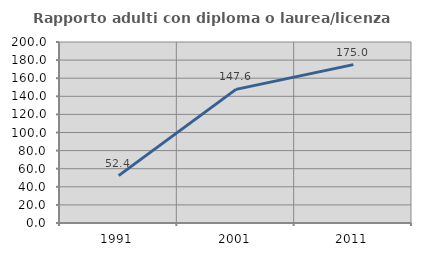
| Category | Rapporto adulti con diploma o laurea/licenza media  |
|---|---|
| 1991.0 | 52.381 |
| 2001.0 | 147.619 |
| 2011.0 | 175 |